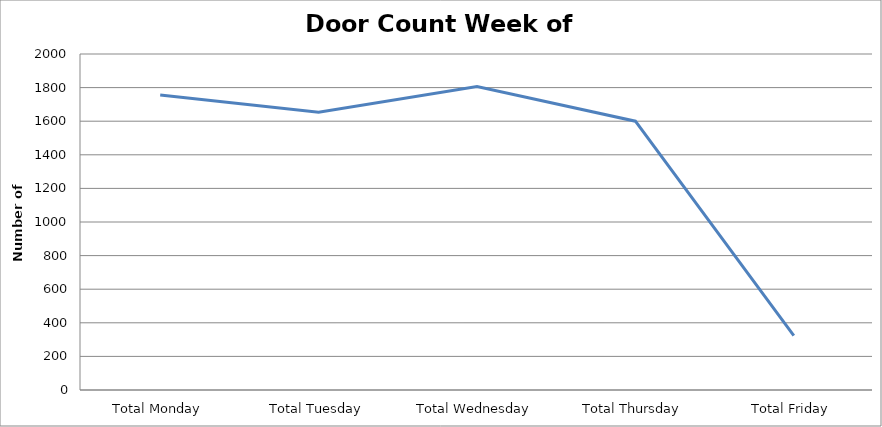
| Category | Series 0 |
|---|---|
| Total Monday | 1756 |
| Total Tuesday | 1654 |
| Total Wednesday | 1807 |
| Total Thursday | 1600 |
| Total Friday | 324 |